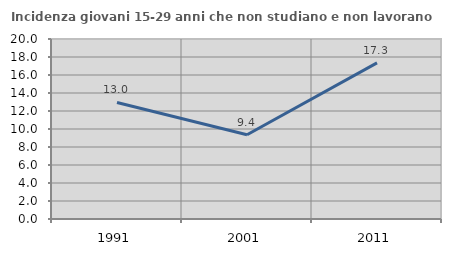
| Category | Incidenza giovani 15-29 anni che non studiano e non lavorano  |
|---|---|
| 1991.0 | 12.95 |
| 2001.0 | 9.364 |
| 2011.0 | 17.345 |